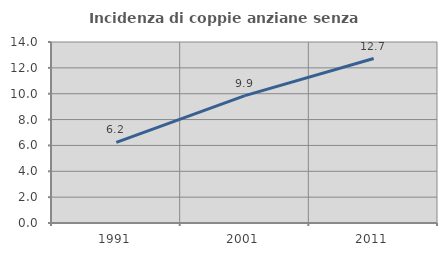
| Category | Incidenza di coppie anziane senza figli  |
|---|---|
| 1991.0 | 6.235 |
| 2001.0 | 9.854 |
| 2011.0 | 12.723 |